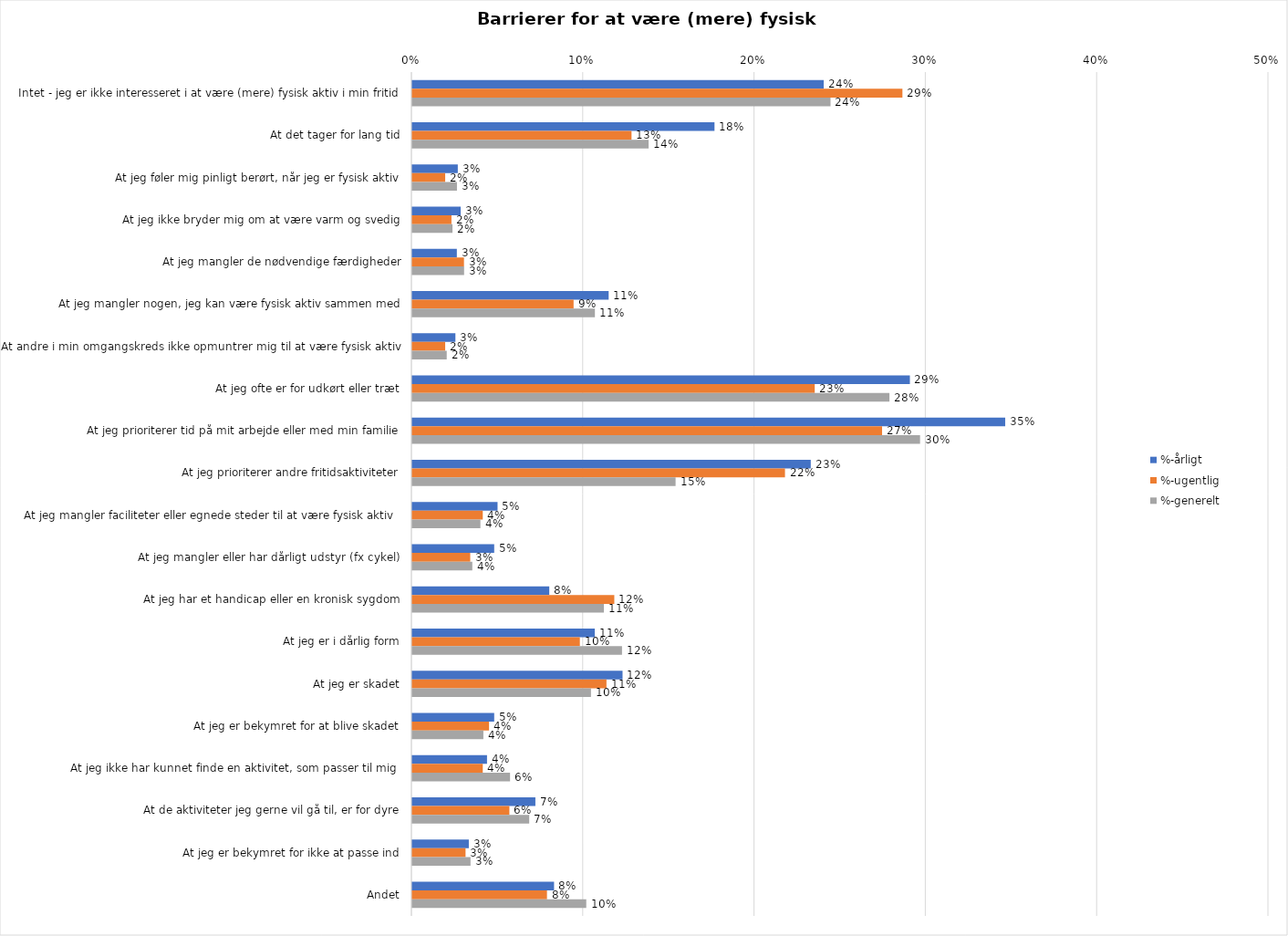
| Category | %-årligt | %-ugentlig | %-generelt |
|---|---|---|---|
| Intet - jeg er ikke interesseret i at være (mere) fysisk aktiv i min fritid | 0.24 | 0.286 | 0.244 |
| At det tager for lang tid | 0.176 | 0.128 | 0.138 |
| At jeg føler mig pinligt berørt, når jeg er fysisk aktiv | 0.027 | 0.019 | 0.026 |
| At jeg ikke bryder mig om at være varm og svedig | 0.028 | 0.023 | 0.023 |
| At jeg mangler de nødvendige færdigheder | 0.026 | 0.03 | 0.03 |
| At jeg mangler nogen, jeg kan være fysisk aktiv sammen med | 0.115 | 0.094 | 0.107 |
| At andre i min omgangskreds ikke opmuntrer mig til at være fysisk aktiv | 0.025 | 0.019 | 0.02 |
| At jeg ofte er for udkørt eller træt | 0.29 | 0.235 | 0.279 |
| At jeg prioriterer tid på mit arbejde eller med min familie | 0.346 | 0.274 | 0.296 |
| At jeg prioriterer andre fritidsaktiviteter | 0.233 | 0.218 | 0.154 |
| At jeg mangler faciliteter eller egnede steder til at være fysisk aktiv  | 0.05 | 0.041 | 0.04 |
| At jeg mangler eller har dårligt udstyr (fx cykel) | 0.048 | 0.034 | 0.035 |
| At jeg har et handicap eller en kronisk sygdom | 0.08 | 0.118 | 0.112 |
| At jeg er i dårlig form | 0.107 | 0.098 | 0.122 |
| At jeg er skadet | 0.123 | 0.113 | 0.104 |
| At jeg er bekymret for at blive skadet | 0.048 | 0.045 | 0.041 |
| At jeg ikke har kunnet finde en aktivitet, som passer til mig  | 0.044 | 0.041 | 0.057 |
| At de aktiviteter jeg gerne vil gå til, er for dyre | 0.072 | 0.057 | 0.068 |
| At jeg er bekymret for ikke at passe ind | 0.033 | 0.031 | 0.034 |
| Andet | 0.083 | 0.079 | 0.102 |